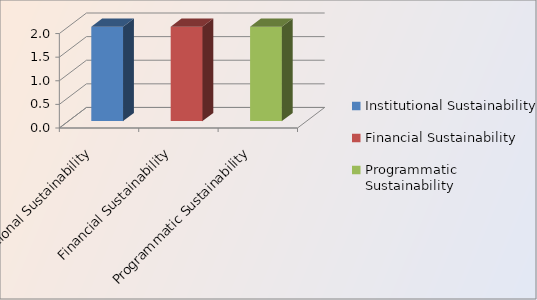
| Category | Series 0 |
|---|---|
| Institutional Sustainability  | 2 |
| Financial Sustainability  | 2 |
| Programmatic Sustainability  | 2 |